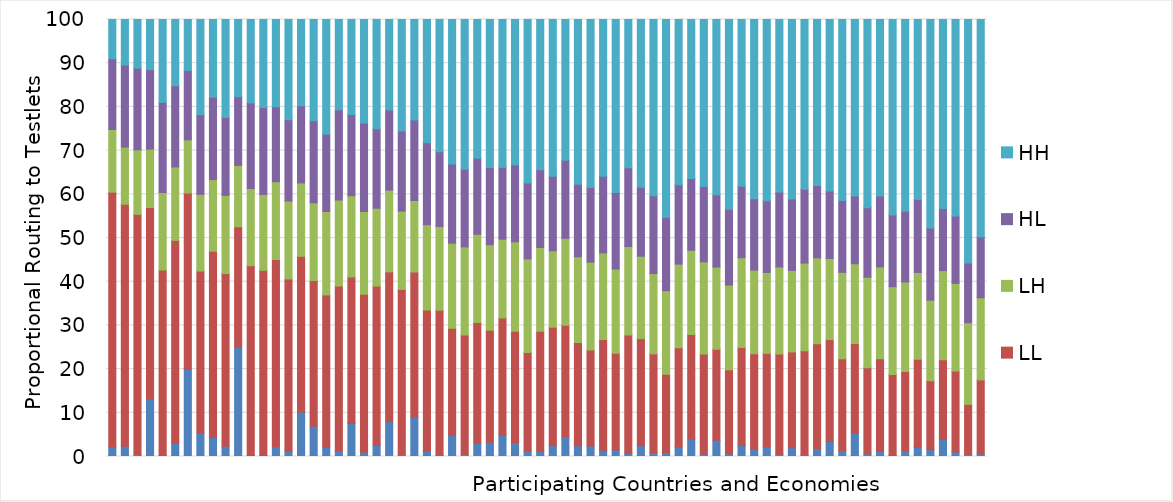
| Category | Missing/ Undetermined | LL | LH | HL | HH |
|---|---|---|---|---|---|
| PHL | 2.24 | 58.261 | 14.323 | 16.204 | 8.973 |
| DOM | 2.355 | 55.37 | 13.078 | 18.791 | 10.406 |
| KSV | 0.376 | 55.042 | 14.769 | 18.683 | 11.131 |
| MAR | 13.149 | 43.836 | 13.355 | 18.183 | 11.476 |
| IDN | 0.248 | 42.404 | 17.738 | 20.64 | 18.97 |
| GEO | 3.082 | 46.372 | 16.807 | 18.581 | 15.159 |
| PAN | 19.952 | 40.335 | 12.169 | 15.885 | 11.659 |
| KAZ | 5.408 | 37.023 | 17.563 | 18.204 | 21.802 |
| QAZ | 4.38 | 42.596 | 16.391 | 18.852 | 17.782 |
| THA | 2.334 | 39.531 | 17.888 | 17.841 | 22.406 |
| PER | 25.081 | 27.487 | 14.034 | 15.73 | 17.668 |
| BIH | 0.156 | 43.502 | 17.65 | 19.611 | 19.082 |
| ALB | 0.236 | 42.361 | 17.384 | 19.884 | 20.135 |
| BRN | 2.255 | 42.824 | 17.794 | 17.135 | 19.991 |
| QAT | 1.222 | 39.406 | 17.833 | 18.578 | 22.961 |
| BRA | 10.209 | 35.606 | 16.795 | 17.668 | 19.721 |
| COL | 6.936 | 33.311 | 17.818 | 18.748 | 23.186 |
| BGR | 2.04 | 34.926 | 19.097 | 17.662 | 26.275 |
| MYS | 1.318 | 37.722 | 19.675 | 20.651 | 20.635 |
| MEX | 7.574 | 33.502 | 18.6 | 18.559 | 21.764 |
| MNE | 0.945 | 36.184 | 18.917 | 20.282 | 23.672 |
| QCY | 2.653 | 36.337 | 17.823 | 18.187 | 25 |
| CRI | 7.938 | 34.306 | 18.718 | 18.34 | 20.699 |
| ARE | 0.42 | 37.817 | 17.928 | 18.291 | 25.543 |
| URY | 8.92 | 33.289 | 16.372 | 18.423 | 22.996 |
| SRB | 1.256 | 32.244 | 19.549 | 18.747 | 28.204 |
| MLT | 0.267 | 33.214 | 19.162 | 17.112 | 30.244 |
| CHL | 4.868 | 24.472 | 19.473 | 18.121 | 33.067 |
| SVK | 0.533 | 27.282 | 20.148 | 17.758 | 34.279 |
| GRC | 3.092 | 27.55 | 20.209 | 17.398 | 31.751 |
| TUR | 3.266 | 25.602 | 19.608 | 17.678 | 33.846 |
| LUX | 4.857 | 26.845 | 18.031 | 16.386 | 33.881 |
| BLR | 3.19 | 25.484 | 20.442 | 17.63 | 33.253 |
| HUN | 1.189 | 22.603 | 21.434 | 17.362 | 37.412 |
| LTU | 1.248 | 27.394 | 19.196 | 17.789 | 34.373 |
| ISR | 2.488 | 27.101 | 17.488 | 17.079 | 35.845 |
| ISL | 4.575 | 25.471 | 19.876 | 17.867 | 32.21 |
| ESP | 2.475 | 23.628 | 19.601 | 16.601 | 37.695 |
| RUS | 2.376 | 22.015 | 20.091 | 17.074 | 38.443 |
| LVA | 1.433 | 25.344 | 19.819 | 17.556 | 35.848 |
| ITA | 1.468 | 22.16 | 19.275 | 17.536 | 39.561 |
| HRV | 0.757 | 27.069 | 20.23 | 18.036 | 33.908 |
| CHE | 2.456 | 24.528 | 18.842 | 15.785 | 38.389 |
| AUT | 0.938 | 22.548 | 18.381 | 17.83 | 40.304 |
| CZE | 0.887 | 17.928 | 19.13 | 16.812 | 45.243 |
| PRT | 2.089 | 22.814 | 19.124 | 18.18 | 37.793 |
| FRA | 3.995 | 23.938 | 19.261 | 16.439 | 36.367 |
| SVN | 0.577 | 22.881 | 21.086 | 17.241 | 38.215 |
| BEL | 3.733 | 20.805 | 18.823 | 16.513 | 40.126 |
| NLD | 0.613 | 19.264 | 19.341 | 17.348 | 43.434 |
| NOR | 2.528 | 22.411 | 20.554 | 16.357 | 38.149 |
| AUS | 1.666 | 21.847 | 19.125 | 16.34 | 41.022 |
| DEU | 2.242 | 21.371 | 18.513 | 16.421 | 41.453 |
| GBR | 0.536 | 22.905 | 19.923 | 17.188 | 39.449 |
| JPN | 2.013 | 21.918 | 18.661 | 16.353 | 41.054 |
| TAP | 0.276 | 23.937 | 20.044 | 16.911 | 38.832 |
| DNK | 1.857 | 23.956 | 19.643 | 16.557 | 37.987 |
| USA | 3.427 | 23.321 | 18.574 | 15.422 | 39.255 |
| NZL | 1.375 | 20.971 | 19.79 | 16.472 | 41.392 |
| SWE | 5.377 | 20.472 | 18.256 | 15.531 | 40.363 |
| POL | 0.601 | 19.706 | 20.715 | 15.921 | 43.057 |
| IRL | 1.148 | 21.212 | 21.033 | 16.192 | 40.416 |
| KOR | 0.211 | 18.571 | 20.075 | 16.421 | 44.722 |
| EST | 1.204 | 18.228 | 20.504 | 16.196 | 43.868 |
| CAN | 2.081 | 20.15 | 19.885 | 16.686 | 41.198 |
| FIN | 1.569 | 15.763 | 18.438 | 16.53 | 47.7 |
| MAC | 3.947 | 18.172 | 20.424 | 14.225 | 43.232 |
| HKG | 1.036 | 18.502 | 20.08 | 15.442 | 44.94 |
| QCI | 0.506 | 11.425 | 18.68 | 13.664 | 55.725 |
| SGP | 0.629 | 16.891 | 18.793 | 13.956 | 49.73 |